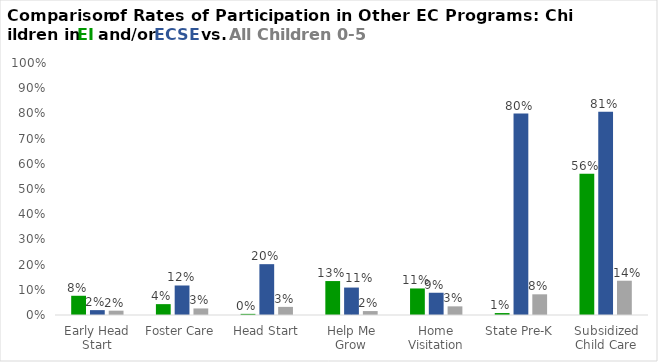
| Category | % EI Children Participating | % ECSE Children Participating | % All Children 0-5 |
|---|---|---|---|
| Early Head Start | 0.076 | 0.019 | 0.017 |
| Foster Care | 0.043 | 0.117 | 0.026 |
| Head Start | 0.004 | 0.202 | 0.032 |
| Help Me Grow | 0.135 | 0.109 | 0.016 |
| Home Visitation | 0.105 | 0.088 | 0.034 |
| State Pre-K | 0.008 | 0.8 | 0.082 |
| Subsidized Child Care | 0.56 | 0.807 | 0.136 |